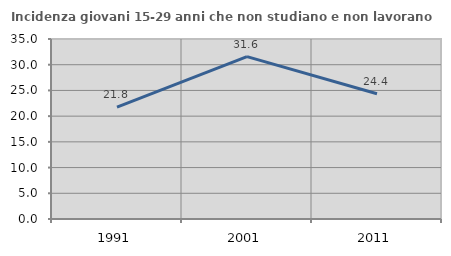
| Category | Incidenza giovani 15-29 anni che non studiano e non lavorano  |
|---|---|
| 1991.0 | 21.769 |
| 2001.0 | 31.565 |
| 2011.0 | 24.365 |